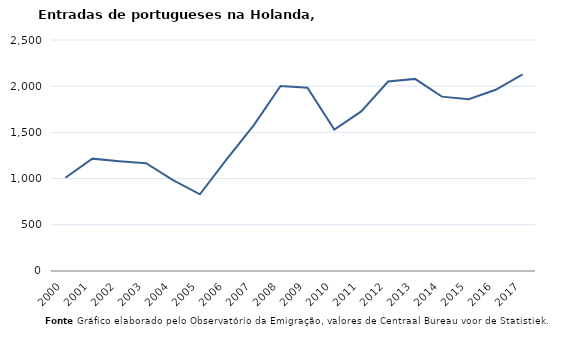
| Category | Entradas |
|---|---|
| 2000.0 | 1009 |
| 2001.0 | 1216 |
| 2002.0 | 1189 |
| 2003.0 | 1166 |
| 2004.0 | 984 |
| 2005.0 | 830 |
| 2006.0 | 1211 |
| 2007.0 | 1577 |
| 2008.0 | 2002 |
| 2009.0 | 1983 |
| 2010.0 | 1530 |
| 2011.0 | 1727 |
| 2012.0 | 2051 |
| 2013.0 | 2079 |
| 2014.0 | 1887 |
| 2015.0 | 1860 |
| 2016.0 | 1961 |
| 2017.0 | 2127 |